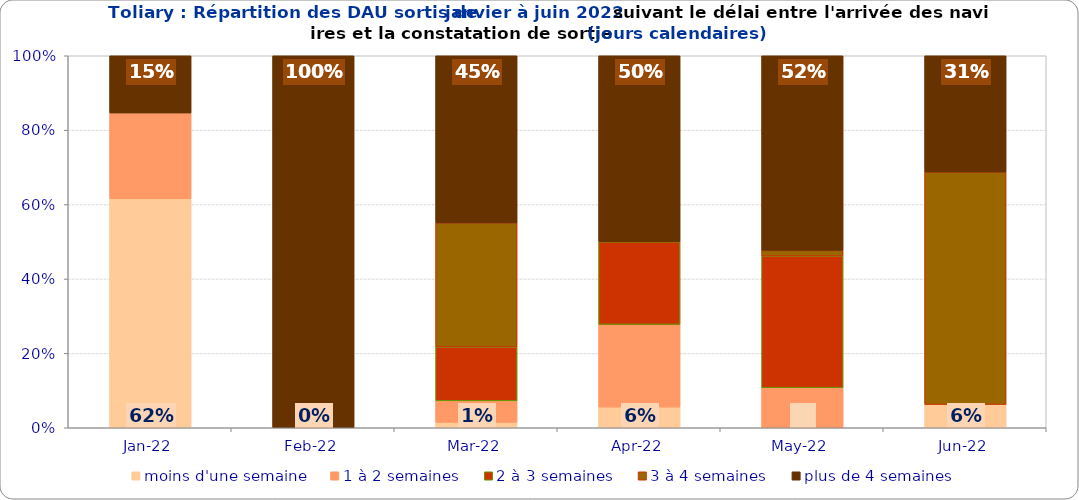
| Category | moins d'une semaine | 1 à 2 semaines | 2 à 3 semaines | 3 à 4 semaines | plus de 4 semaines |
|---|---|---|---|---|---|
| 2022-01-01 | 0.615 | 0.231 | 0 | 0 | 0.154 |
| 2022-02-01 | 0 | 0 | 0 | 0 | 1 |
| 2022-03-01 | 0.014 | 0.058 | 0.145 | 0.333 | 0.449 |
| 2022-04-01 | 0.056 | 0.222 | 0.222 | 0 | 0.5 |
| 2022-05-01 | 0 | 0.108 | 0.354 | 0.015 | 0.523 |
| 2022-06-01 | 0.062 | 0 | 0 | 0.625 | 0.312 |